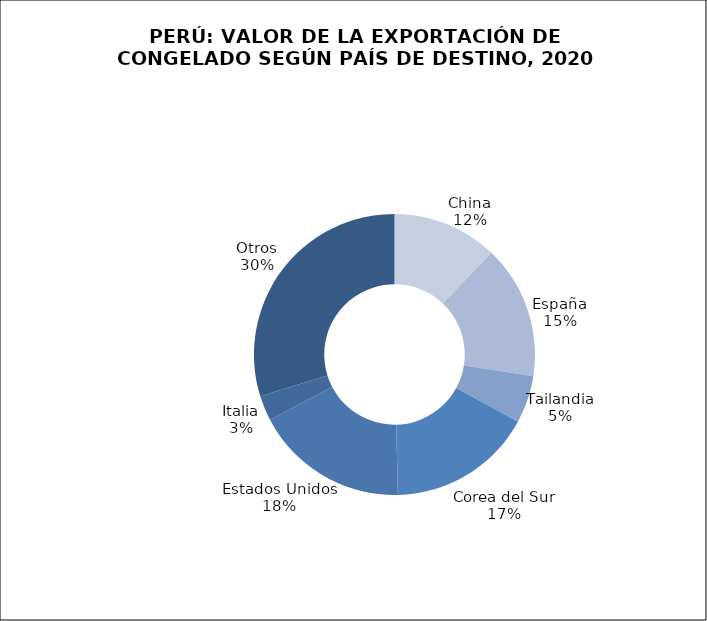
| Category | Series 0 |
|---|---|
| China | 137369.241 |
| España | 174369.267 |
| Tailandia | 61937.633 |
| Corea del Sur | 189231.719 |
| Estados Unidos | 200972.021 |
| Italia | 32541.775 |
| Otros | 338196.175 |